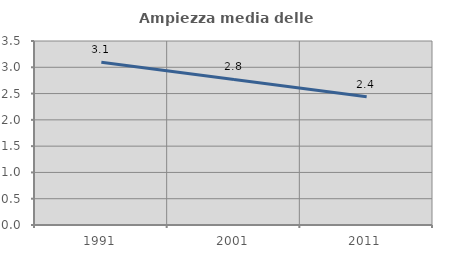
| Category | Ampiezza media delle famiglie |
|---|---|
| 1991.0 | 3.098 |
| 2001.0 | 2.768 |
| 2011.0 | 2.442 |